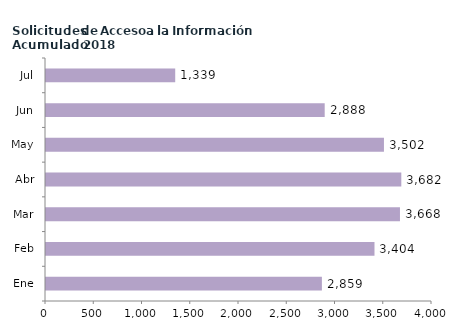
| Category | Series 0 |
|---|---|
| Ene | 2859 |
| Feb | 3404 |
| Mar | 3668 |
| Abr | 3682 |
| May | 3502 |
| Jun | 2888 |
| Jul | 1339 |